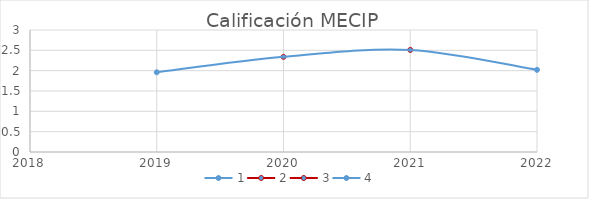
| Category | Series 0 |
|---|---|
| 2019.0 | 1.96 |
| 2020.0 | 2.34 |
| 2021.0 | 2.51 |
| 2022.0 | 2.02 |